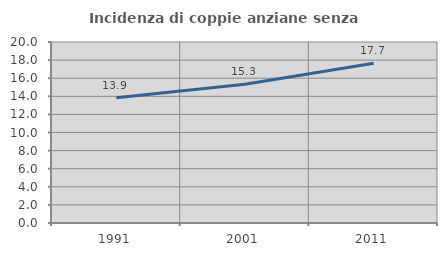
| Category | Incidenza di coppie anziane senza figli  |
|---|---|
| 1991.0 | 13.85 |
| 2001.0 | 15.323 |
| 2011.0 | 17.66 |